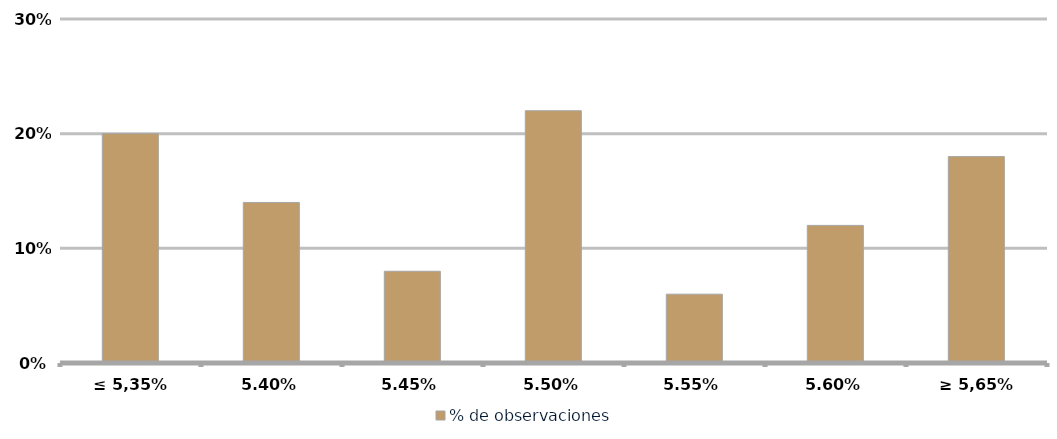
| Category | % de observaciones  |
|---|---|
| ≤ 5,35% | 0.2 |
| 5,40% | 0.14 |
| 5,45% | 0.08 |
| 5,50% | 0.22 |
| 5,55% | 0.06 |
| 5,60% | 0.12 |
| ≥ 5,65% | 0.18 |